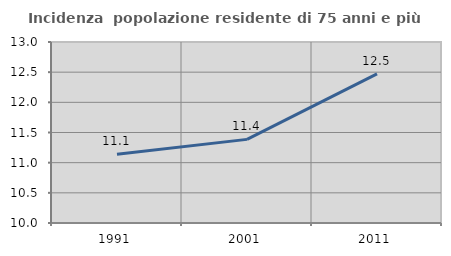
| Category | Incidenza  popolazione residente di 75 anni e più |
|---|---|
| 1991.0 | 11.139 |
| 2001.0 | 11.386 |
| 2011.0 | 12.471 |